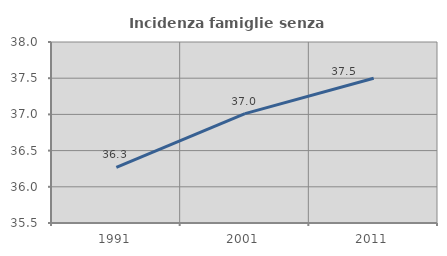
| Category | Incidenza famiglie senza nuclei |
|---|---|
| 1991.0 | 36.268 |
| 2001.0 | 37.011 |
| 2011.0 | 37.5 |